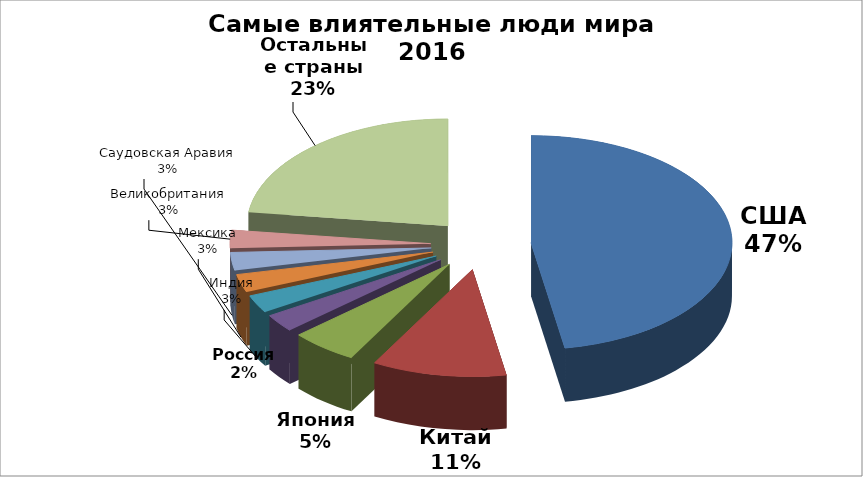
| Category | Series 0 |
|---|---|
| США | 35 |
| Китай | 8 |
| Япония | 4 |
| Россия | 2 |
| Индия | 2 |
| Мексика | 2 |
| Саудовская Аравия | 2 |
| Великобритания | 2 |
| Остальные страны | 17 |